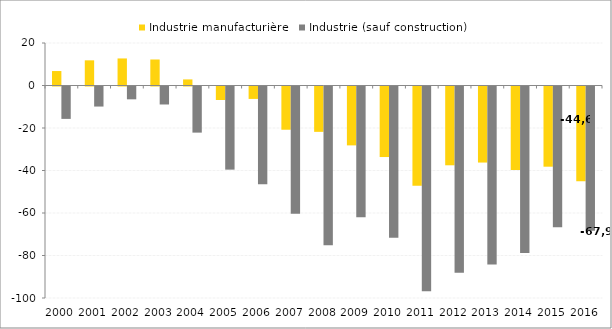
| Category | Industrie manufacturière | Industrie (sauf construction) |
|---|---|---|
| 2000.0 | 6.807 | -15.244 |
| 2001.0 | 11.843 | -9.437 |
| 2002.0 | 12.732 | -6.035 |
| 2003.0 | 12.24 | -8.463 |
| 2004.0 | 2.861 | -21.707 |
| 2005.0 | -6.36 | -39.129 |
| 2006.0 | -5.846 | -46.023 |
| 2007.0 | -20.347 | -59.891 |
| 2008.0 | -21.345 | -74.748 |
| 2009.0 | -27.71 | -61.486 |
| 2010.0 | -33.193 | -71.145 |
| 2011.0 | -46.694 | -96.355 |
| 2012.0 | -37.079 | -87.698 |
| 2013.0 | -35.79 | -83.813 |
| 2014.0 | -39.345 | -78.328 |
| 2015.0 | -37.738 | -66.185 |
| 2016.0 | -44.627 | -67.872 |